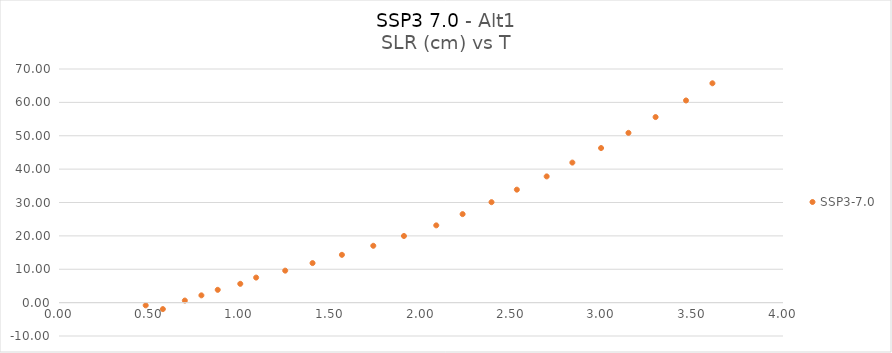
| Category | SSP3-7.0 |
|---|---|
| 0.573801925 | -1.941 |
| 0.479031654 | -0.818 |
| 0.695197934 | 0.621 |
| 0.786748548 | 2.18 |
| 0.877021499 | 3.834 |
| 1.001520332 | 5.633 |
| 1.089128948 | 7.505 |
| 1.249789297 | 9.582 |
| 1.40084264 | 11.846 |
| 1.563106609 | 14.321 |
| 1.736445254 | 17.03 |
| 1.905756517 | 19.966 |
| 2.084304689 | 23.151 |
| 2.229851962 | 26.518 |
| 2.38959776 | 30.097 |
| 2.529608217 | 33.846 |
| 2.694314026 | 37.817 |
| 2.836266075 | 41.961 |
| 2.994872826 | 46.315 |
| 3.14621165 | 50.863 |
| 3.296099987 | 55.601 |
| 3.46427976 | 60.57 |
| 3.610067907 | 65.721 |